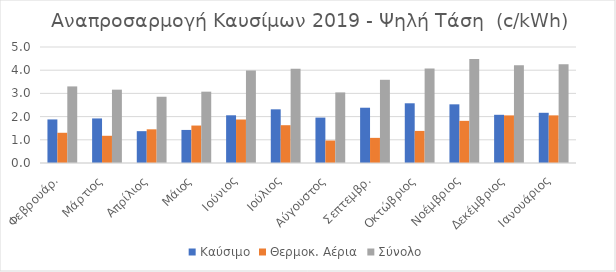
| Category | Καύσιμο | Θερμοκ. Αέρια | Σύνολο |
|---|---|---|---|
| Φεβρουάρ. | 1.878 | 1.303 | 3.301 |
| Μάρτιος | 1.92 | 1.173 | 3.161 |
| Απρίλιος | 1.372 | 1.452 | 2.856 |
| Μάιος | 1.425 | 1.614 | 3.074 |
| Ιούνιος | 2.056 | 1.875 | 3.985 |
| Ιούλιος | 2.314 | 1.629 | 4.066 |
| Αύγουστος | 1.957 | 0.969 | 3.043 |
| Σεπτεμβρ. | 2.382 | 1.084 | 3.586 |
| Οκτώβριος | 2.574 | 1.383 | 4.074 |
| Νοέμβριος | 2.529 | 1.817 | 4.478 |
| Δεκέμβριος | 2.078 | 2.052 | 4.216 |
| Ιανουάριος | 2.164 | 2.053 | 4.259 |